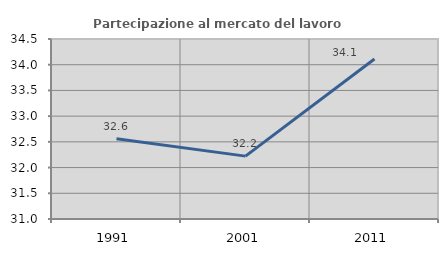
| Category | Partecipazione al mercato del lavoro  femminile |
|---|---|
| 1991.0 | 32.561 |
| 2001.0 | 32.222 |
| 2011.0 | 34.11 |